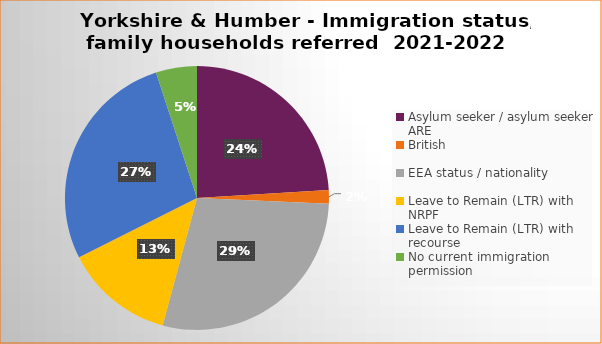
| Category | Number  | Percentage |
|---|---|---|
| Asylum seeker / asylum seeker ARE | 43 | 0.24 |
| British | 3 | 0.017 |
| EEA status / nationality  | 51 | 0.29 |
| Leave to Remain (LTR) with NRPF | 24 | 0.134 |
| Leave to Remain (LTR) with recourse | 49 | 0.274 |
| No current immigration permission | 9 | 0.05 |